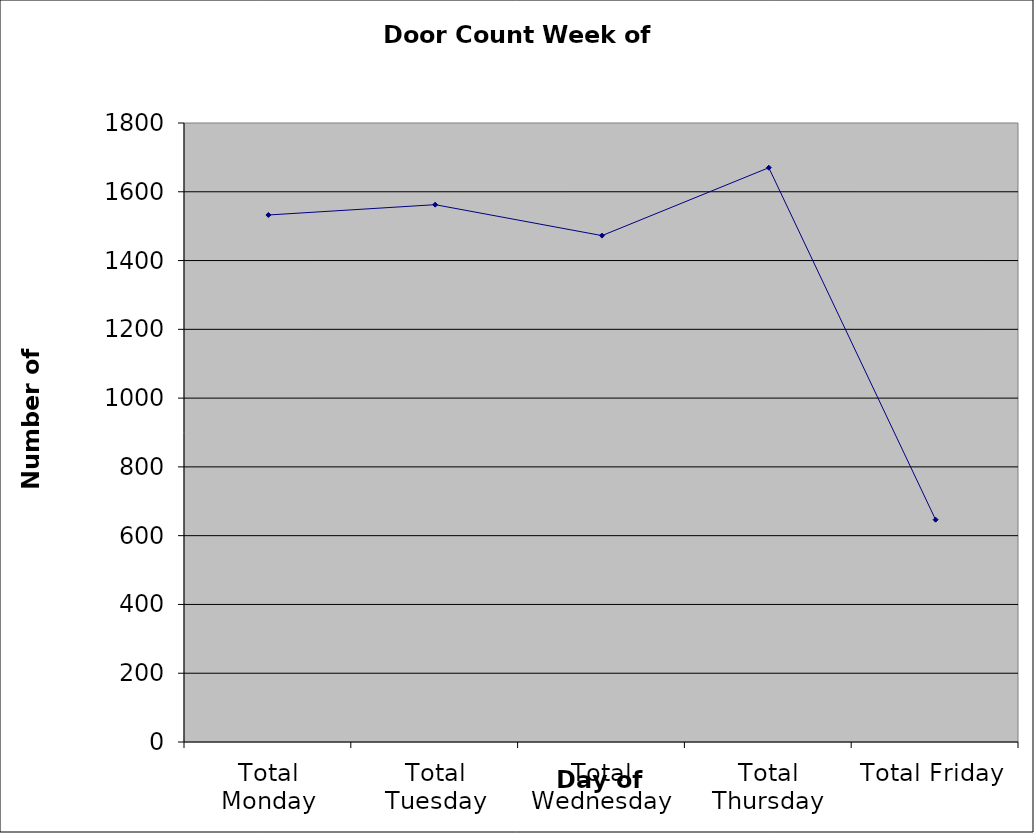
| Category | Series 0 |
|---|---|
| Total Monday | 1532.5 |
| Total Tuesday | 1562.5 |
| Total Wednesday | 1472.5 |
| Total Thursday | 1670 |
| Total Friday | 646.5 |